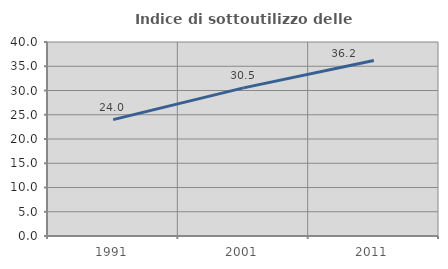
| Category | Indice di sottoutilizzo delle abitazioni  |
|---|---|
| 1991.0 | 23.993 |
| 2001.0 | 30.546 |
| 2011.0 | 36.199 |